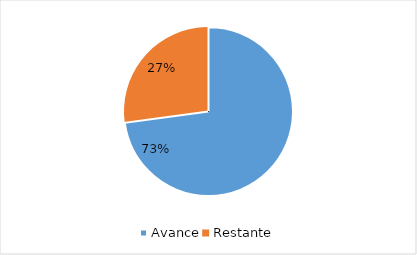
| Category | Series 0 |
|---|---|
| Avance | 0.729 |
| Restante | 0.271 |